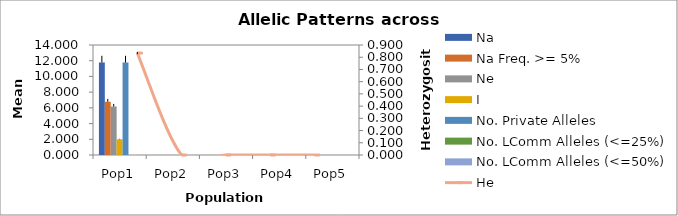
| Category | Na | Na Freq. >= 5% | Ne | I | No. Private Alleles | No. LComm Alleles (<=25%) | No. LComm Alleles (<=50%) |
|---|---|---|---|---|---|---|---|
| Pop1 | 11.778 | 6.778 | 6.173 | 2.001 | 11.778 | 0 | 0 |
| Pop2 | 0 | 0 | 0 | 0 | 0 | 0 | 0 |
| Pop3 | 0 | 0 | 0 | 0 | 0 | 0 | 0 |
| Pop4 | 0 | 0 | 0 | 0 | 0 | 0 | 0 |
| Pop5 | 0 | 0 | 0 | 0 | 0 | 0 | 0 |